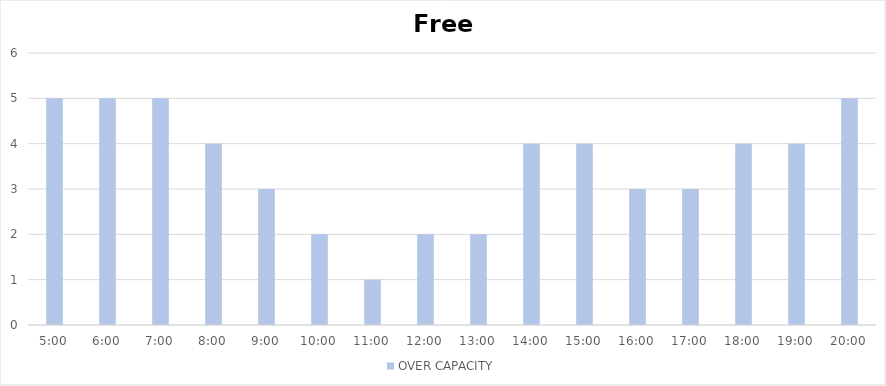
| Category | OVER CAPACITY |
|---|---|
| 0.20833333333333334 | 5 |
| 0.25 | 5 |
| 0.2916666666666667 | 5 |
| 0.3333333333333333 | 4 |
| 0.375 | 3 |
| 0.4166666666666667 | 2 |
| 0.4583333333333333 | 1 |
| 0.5 | 2 |
| 0.5416666666666666 | 2 |
| 0.5833333333333334 | 4 |
| 0.625 | 4 |
| 0.6666666666666666 | 3 |
| 0.7083333333333334 | 3 |
| 0.75 | 4 |
| 0.7916666666666666 | 4 |
| 0.8333333333333334 | 5 |